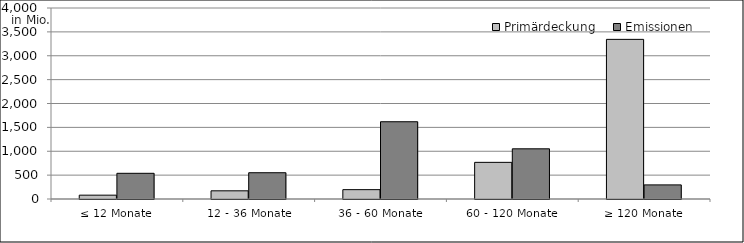
| Category | Primärdeckung | Emissionen |
|---|---|---|
| ≤ 12 Monate | 80469630.455 | 538000000 |
| 12 - 36 Monate | 171445511.605 | 550150000 |
| 36 - 60 Monate | 195949181.79 | 1618000000 |
| 60 - 120 Monate | 767639877.2 | 1051000000 |
| ≥ 120 Monate | 3343168018.48 | 295673602.88 |